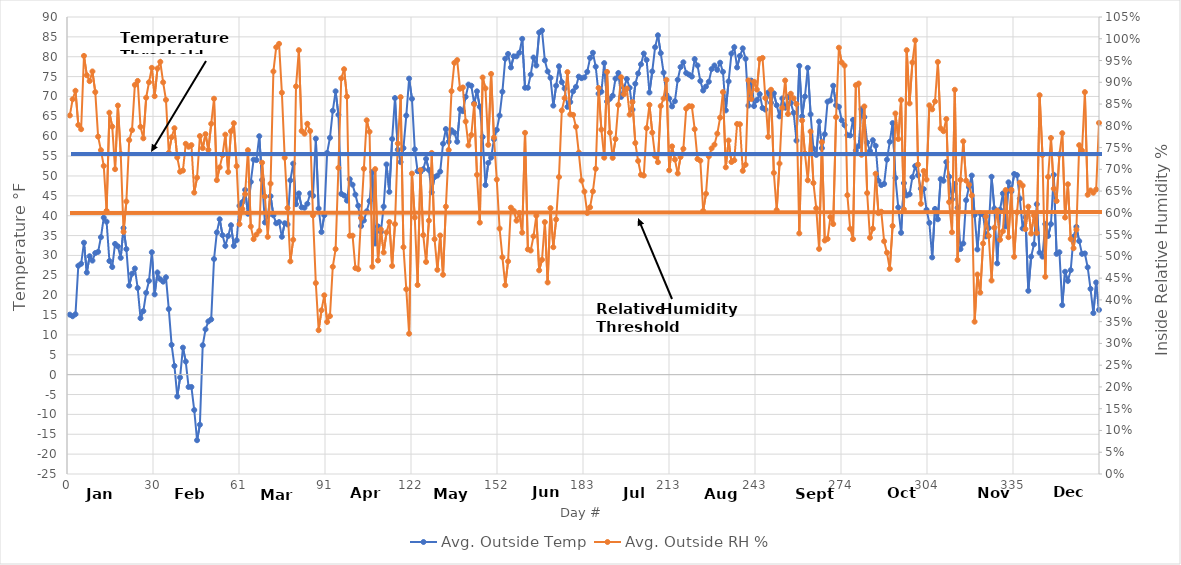
| Category | Avg. Outside Temp |
|---|---|
| 0 | 15.1 |
| 1 | 14.7 |
| 2 | 15.2 |
| 3 | 27.4 |
| 4 | 27.9 |
| 5 | 33.2 |
| 6 | 25.7 |
| 7 | 29.8 |
| 8 | 28.7 |
| 9 | 30.6 |
| 10 | 30.9 |
| 11 | 34.6 |
| 12 | 39.5 |
| 13 | 38.5 |
| 14 | 28.6 |
| 15 | 27.1 |
| 16 | 32.9 |
| 17 | 32.3 |
| 18 | 29.4 |
| 19 | 36.9 |
| 20 | 31.6 |
| 21 | 22.4 |
| 22 | 25.4 |
| 23 | 26.7 |
| 24 | 21.8 |
| 25 | 14.2 |
| 26 | 16 |
| 27 | 20.6 |
| 28 | 23.6 |
| 29 | 30.8 |
| 30 | 20.2 |
| 31 | 25.7 |
| 32 | 24 |
| 33 | 23.4 |
| 34 | 24.5 |
| 35 | 16.5 |
| 36 | 7.5 |
| 37 | 2.2 |
| 38 | -5.5 |
| 39 | -0.7 |
| 40 | 6.8 |
| 41 | 3.3 |
| 42 | -3.1 |
| 43 | -3.1 |
| 44 | -8.9 |
| 45 | -16.5 |
| 46 | -12.6 |
| 47 | 7.4 |
| 48 | 11.4 |
| 49 | 13.4 |
| 50 | 13.9 |
| 51 | 29.1 |
| 52 | 35.8 |
| 53 | 39.1 |
| 54 | 35.1 |
| 55 | 32.4 |
| 56 | 34.9 |
| 57 | 37.6 |
| 58 | 32.4 |
| 59 | 33.8 |
| 60 | 42.5 |
| 61 | 43.4 |
| 62 | 46.5 |
| 63 | 40.5 |
| 64 | 48.5 |
| 65 | 54.1 |
| 66 | 54 |
| 67 | 60 |
| 68 | 49 |
| 69 | 38.3 |
| 70 | 40 |
| 71 | 44.9 |
| 72 | 40.1 |
| 73 | 38.1 |
| 74 | 38.4 |
| 75 | 34.7 |
| 76 | 38.1 |
| 77 | 37.8 |
| 78 | 48.9 |
| 79 | 53.1 |
| 80 | 42.9 |
| 81 | 45.6 |
| 82 | 42.1 |
| 83 | 42 |
| 84 | 43 |
| 85 | 45.6 |
| 86 | 45 |
| 87 | 59.4 |
| 88 | 41.8 |
| 89 | 35.9 |
| 90 | 40.1 |
| 91 | 55.8 |
| 92 | 59.6 |
| 93 | 66.4 |
| 94 | 71.3 |
| 95 | 65.4 |
| 96 | 45.5 |
| 97 | 45.1 |
| 98 | 43.8 |
| 99 | 49.2 |
| 100 | 47.8 |
| 101 | 45.3 |
| 102 | 42.5 |
| 103 | 37.4 |
| 104 | 38.8 |
| 105 | 41.1 |
| 106 | 43.7 |
| 107 | 51 |
| 108 | 33 |
| 109 | 37.3 |
| 110 | 35.9 |
| 111 | 42.3 |
| 112 | 52.9 |
| 113 | 46 |
| 114 | 59.3 |
| 115 | 69.6 |
| 116 | 56.6 |
| 117 | 53.5 |
| 118 | 57 |
| 119 | 65.2 |
| 120 | 74.5 |
| 121 | 69.4 |
| 122 | 56.7 |
| 123 | 51.2 |
| 124 | 51 |
| 125 | 51.7 |
| 126 | 54.3 |
| 127 | 51.5 |
| 128 | 45.9 |
| 129 | 49.7 |
| 130 | 50.1 |
| 131 | 51.1 |
| 132 | 58.1 |
| 133 | 61.8 |
| 134 | 58.6 |
| 135 | 61.5 |
| 136 | 60.9 |
| 137 | 58.6 |
| 138 | 66.8 |
| 139 | 66.3 |
| 140 | 69.9 |
| 141 | 73 |
| 142 | 72.7 |
| 143 | 68.3 |
| 144 | 71.3 |
| 145 | 67.4 |
| 146 | 59.8 |
| 147 | 47.7 |
| 148 | 53.3 |
| 149 | 54.6 |
| 150 | 59.2 |
| 151 | 61.6 |
| 152 | 65.2 |
| 153 | 71.2 |
| 154 | 79.5 |
| 155 | 80.7 |
| 156 | 77.3 |
| 157 | 80.1 |
| 158 | 80.1 |
| 159 | 81 |
| 160 | 84.5 |
| 161 | 72.2 |
| 162 | 72.2 |
| 163 | 75.5 |
| 164 | 79.8 |
| 165 | 77.8 |
| 166 | 86.1 |
| 167 | 86.6 |
| 168 | 79.1 |
| 169 | 76.3 |
| 170 | 74.7 |
| 171 | 67.7 |
| 172 | 72.7 |
| 173 | 77.6 |
| 174 | 73.6 |
| 175 | 72 |
| 176 | 67.4 |
| 177 | 68.6 |
| 178 | 71.3 |
| 179 | 72.4 |
| 180 | 75 |
| 181 | 74.6 |
| 182 | 74.8 |
| 183 | 76.2 |
| 184 | 79.7 |
| 185 | 81 |
| 186 | 77.5 |
| 187 | 70.7 |
| 188 | 71.2 |
| 189 | 78.4 |
| 190 | 68.7 |
| 191 | 69.4 |
| 192 | 70.2 |
| 193 | 74.5 |
| 194 | 75.9 |
| 195 | 69.9 |
| 196 | 72.2 |
| 197 | 74.4 |
| 198 | 72.2 |
| 199 | 66.7 |
| 200 | 73.2 |
| 201 | 75.8 |
| 202 | 78.1 |
| 203 | 80.8 |
| 204 | 79.2 |
| 205 | 71 |
| 206 | 76.3 |
| 207 | 82.4 |
| 208 | 85.4 |
| 209 | 80.9 |
| 210 | 76 |
| 211 | 70.4 |
| 212 | 69.5 |
| 213 | 67.5 |
| 214 | 68.8 |
| 215 | 74.2 |
| 216 | 77.4 |
| 217 | 78.6 |
| 218 | 75.9 |
| 219 | 75.5 |
| 220 | 75 |
| 221 | 79.4 |
| 222 | 77.8 |
| 223 | 73.9 |
| 224 | 71.5 |
| 225 | 72.5 |
| 226 | 73.7 |
| 227 | 76.9 |
| 228 | 77.8 |
| 229 | 76.7 |
| 230 | 78.5 |
| 231 | 76.2 |
| 232 | 66.5 |
| 233 | 73.8 |
| 234 | 80.8 |
| 235 | 82.4 |
| 236 | 77.3 |
| 237 | 80.2 |
| 238 | 82.1 |
| 239 | 79.5 |
| 240 | 67.7 |
| 241 | 74 |
| 242 | 67.6 |
| 243 | 69.1 |
| 244 | 70.6 |
| 245 | 67.1 |
| 246 | 66.7 |
| 247 | 71 |
| 248 | 68.4 |
| 249 | 70.8 |
| 250 | 67.8 |
| 251 | 65 |
| 252 | 69.5 |
| 253 | 67.2 |
| 254 | 69.9 |
| 255 | 68.4 |
| 256 | 65.9 |
| 257 | 58.9 |
| 258 | 77.7 |
| 259 | 65 |
| 260 | 70 |
| 261 | 77.2 |
| 262 | 65.5 |
| 263 | 56.9 |
| 264 | 55.3 |
| 265 | 63.7 |
| 266 | 57 |
| 267 | 60.5 |
| 268 | 68.7 |
| 269 | 69 |
| 270 | 72.7 |
| 271 | 67.8 |
| 272 | 67.4 |
| 273 | 64 |
| 274 | 62.8 |
| 275 | 60.3 |
| 276 | 60.2 |
| 277 | 64.1 |
| 278 | 56.4 |
| 279 | 57.5 |
| 280 | 66.8 |
| 281 | 64.8 |
| 282 | 58.4 |
| 283 | 56.3 |
| 284 | 59 |
| 285 | 57.6 |
| 286 | 48.8 |
| 287 | 47.7 |
| 288 | 48 |
| 289 | 54.1 |
| 290 | 58.6 |
| 291 | 63.3 |
| 292 | 49.5 |
| 293 | 42.1 |
| 294 | 35.7 |
| 295 | 48.2 |
| 296 | 45.1 |
| 297 | 45.4 |
| 298 | 49.7 |
| 299 | 52.5 |
| 300 | 50.2 |
| 301 | 46.8 |
| 302 | 46.7 |
| 303 | 41.5 |
| 304 | 38.2 |
| 305 | 29.5 |
| 306 | 41.7 |
| 307 | 39.1 |
| 308 | 49.2 |
| 309 | 48.8 |
| 310 | 53.5 |
| 311 | 49.8 |
| 312 | 44.1 |
| 313 | 48 |
| 314 | 42 |
| 315 | 31.6 |
| 316 | 33 |
| 317 | 43.9 |
| 318 | 47.2 |
| 319 | 50.1 |
| 320 | 40.2 |
| 321 | 31.5 |
| 322 | 40.6 |
| 323 | 40.3 |
| 324 | 34.8 |
| 325 | 36.9 |
| 326 | 49.8 |
| 327 | 41.8 |
| 328 | 28 |
| 329 | 41.5 |
| 330 | 45.6 |
| 331 | 37.3 |
| 332 | 48.4 |
| 333 | 46.1 |
| 334 | 50.5 |
| 335 | 50.2 |
| 336 | 44.3 |
| 337 | 36.8 |
| 338 | 39.6 |
| 339 | 21.1 |
| 340 | 29.7 |
| 341 | 32.8 |
| 342 | 42.9 |
| 343 | 30.7 |
| 344 | 29.7 |
| 345 | 37.9 |
| 346 | 34.9 |
| 347 | 37.9 |
| 348 | 50.3 |
| 349 | 30.4 |
| 350 | 30.8 |
| 351 | 17.5 |
| 352 | 25.9 |
| 353 | 23.6 |
| 354 | 26.3 |
| 355 | 34.7 |
| 356 | 37.2 |
| 357 | 33.6 |
| 358 | 30.4 |
| 359 | 30.5 |
| 360 | 27 |
| 361 | 21.6 |
| 362 | 15.5 |
| 363 | 23.2 |
| 364 | 16.3 |